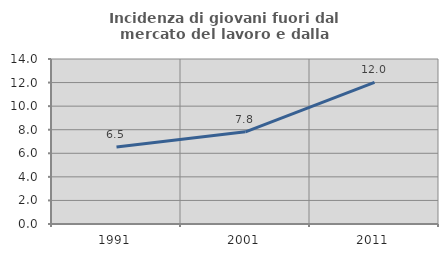
| Category | Incidenza di giovani fuori dal mercato del lavoro e dalla formazione  |
|---|---|
| 1991.0 | 6.528 |
| 2001.0 | 7.821 |
| 2011.0 | 12.023 |